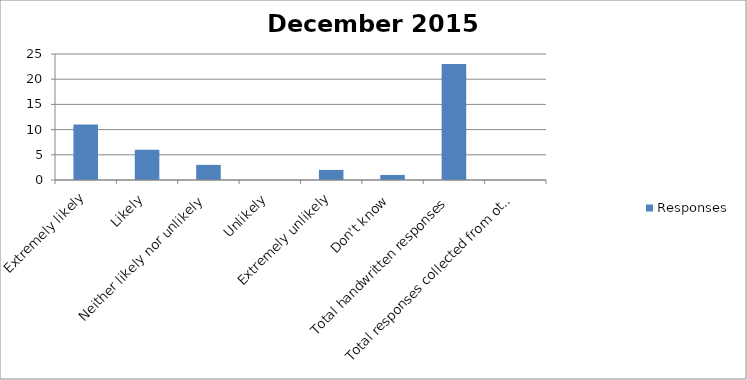
| Category | Responses |
|---|---|
| Extremely likely | 11 |
| Likely | 6 |
| Neither likely nor unlikely | 3 |
| Unlikely | 0 |
| Extremely unlikely | 2 |
| Don't know | 1 |
| Total handwritten responses | 23 |
| Total responses collected from other methods | 0 |